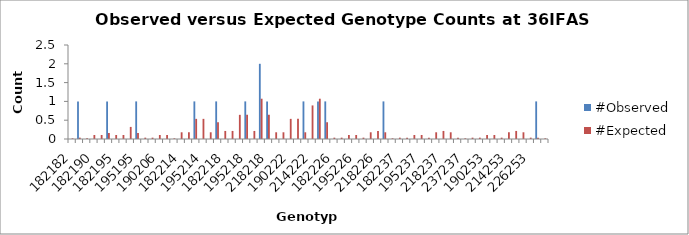
| Category | #Observed | #Expected |
|---|---|---|
| 182182.0 | 0 | 0.018 |
| 182186.0 | 1 | 0.036 |
| 186186.0 | 0 | 0.018 |
| 182190.0 | 0 | 0.107 |
| 186190.0 | 0 | 0.107 |
| 190190.0 | 1 | 0.161 |
| 182195.0 | 0 | 0.107 |
| 186195.0 | 0 | 0.107 |
| 190195.0 | 0 | 0.321 |
| 195195.0 | 1 | 0.161 |
| 182206.0 | 0 | 0.036 |
| 186206.0 | 0 | 0.036 |
| 190206.0 | 0 | 0.107 |
| 195206.0 | 0 | 0.107 |
| 206206.0 | 0 | 0.018 |
| 182214.0 | 0 | 0.179 |
| 186214.0 | 0 | 0.179 |
| 190214.0 | 1 | 0.536 |
| 195214.0 | 0 | 0.536 |
| 206214.0 | 0 | 0.179 |
| 214214.0 | 1 | 0.446 |
| 182218.0 | 0 | 0.214 |
| 186218.0 | 0 | 0.214 |
| 190218.0 | 0 | 0.643 |
| 195218.0 | 1 | 0.643 |
| 206218.0 | 0 | 0.214 |
| 214218.0 | 2 | 1.071 |
| 218218.0 | 1 | 0.643 |
| 182222.0 | 0 | 0.179 |
| 186222.0 | 0 | 0.179 |
| 190222.0 | 0 | 0.536 |
| 195222.0 | 0 | 0.536 |
| 206222.0 | 1 | 0.179 |
| 214222.0 | 0 | 0.893 |
| 218222.0 | 1 | 1.071 |
| 222222.0 | 1 | 0.446 |
| 182226.0 | 0 | 0.036 |
| 186226.0 | 0 | 0.036 |
| 190226.0 | 0 | 0.107 |
| 195226.0 | 0 | 0.107 |
| 206226.0 | 0 | 0.036 |
| 214226.0 | 0 | 0.179 |
| 218226.0 | 0 | 0.214 |
| 222226.0 | 1 | 0.179 |
| 226226.0 | 0 | 0.018 |
| 182237.0 | 0 | 0.036 |
| 186237.0 | 0 | 0.036 |
| 190237.0 | 0 | 0.107 |
| 195237.0 | 0 | 0.107 |
| 206237.0 | 0 | 0.036 |
| 214237.0 | 0 | 0.179 |
| 218237.0 | 0 | 0.214 |
| 222237.0 | 0 | 0.179 |
| 226237.0 | 0 | 0.036 |
| 237237.0 | 0 | 0.018 |
| 182253.0 | 0 | 0.036 |
| 186253.0 | 0 | 0.036 |
| 190253.0 | 0 | 0.107 |
| 195253.0 | 0 | 0.107 |
| 206253.0 | 0 | 0.036 |
| 214253.0 | 0 | 0.179 |
| 218253.0 | 0 | 0.214 |
| 222253.0 | 0 | 0.179 |
| 226253.0 | 0 | 0.036 |
| 237253.0 | 1 | 0.036 |
| 253253.0 | 0 | 0.018 |